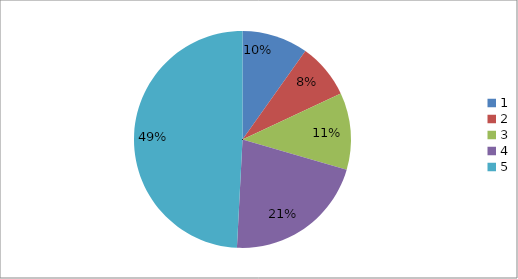
| Category | Series 0 |
|---|---|
| 0 | 0.098 |
| 1 | 0.082 |
| 2 | 0.115 |
| 3 | 0.213 |
| 4 | 0.492 |